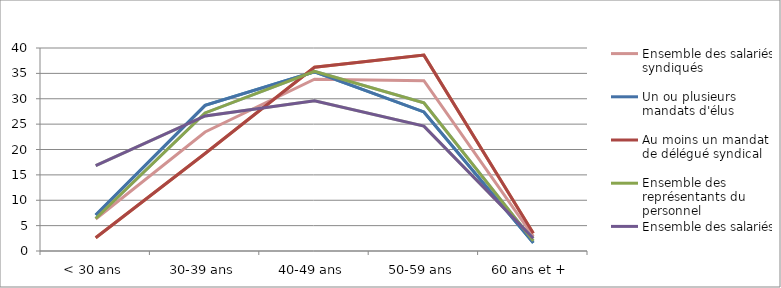
| Category | Un ou plusieurs mandats d'élus | Au moins un mandat 
de délégué syndical | Ensemble des représentants du personnel | Ensemble des salariés syndiqués | Ensemble des salariés |
|---|---|---|---|---|---|
| < 30 ans | 7.1 | 2.6 | 6.4 | 6.31 | 16.8 |
| 30-39 ans | 28.7 | 19.2 | 27.2 | 23.45 | 26.6 |
| 40-49 ans | 35.3 | 36.2 | 35.4 | 33.84 | 29.6 |
| 50-59 ans | 27.4 | 38.6 | 29.2 | 33.55 | 24.6 |
| 60 ans et + | 1.6 | 3.5 | 2 | 2.86 | 2.5 |